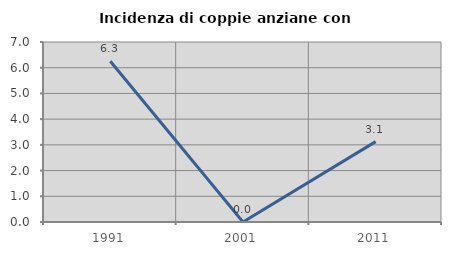
| Category | Incidenza di coppie anziane con figli |
|---|---|
| 1991.0 | 6.25 |
| 2001.0 | 0 |
| 2011.0 | 3.125 |